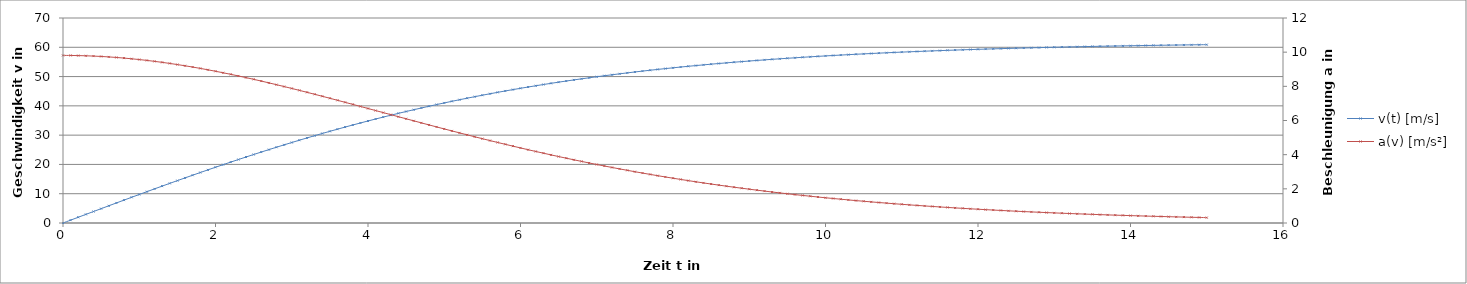
| Category | v(t) [m/s] |
|---|---|
| 0.0 | 0 |
| 0.1 | 0.981 |
| 0.2 | 1.962 |
| 0.30000000000000004 | 2.942 |
| 0.4 | 3.921 |
| 0.5 | 4.898 |
| 0.6 | 5.872 |
| 0.7 | 6.845 |
| 0.7999999999999999 | 7.814 |
| 0.8999999999999999 | 8.779 |
| 0.9999999999999999 | 9.74 |
| 1.0999999999999999 | 10.697 |
| 1.2 | 11.649 |
| 1.3 | 12.595 |
| 1.4000000000000001 | 13.535 |
| 1.5000000000000002 | 14.469 |
| 1.6000000000000003 | 15.397 |
| 1.7000000000000004 | 16.317 |
| 1.8000000000000005 | 17.23 |
| 1.9000000000000006 | 18.135 |
| 2.0000000000000004 | 19.032 |
| 2.1000000000000005 | 19.92 |
| 2.2000000000000006 | 20.8 |
| 2.3000000000000007 | 21.67 |
| 2.400000000000001 | 22.531 |
| 2.500000000000001 | 23.382 |
| 2.600000000000001 | 24.223 |
| 2.700000000000001 | 25.053 |
| 2.800000000000001 | 25.874 |
| 2.9000000000000012 | 26.683 |
| 3.0000000000000013 | 27.482 |
| 3.1000000000000014 | 28.27 |
| 3.2000000000000015 | 29.046 |
| 3.3000000000000016 | 29.811 |
| 3.4000000000000017 | 30.565 |
| 3.5000000000000018 | 31.307 |
| 3.600000000000002 | 32.037 |
| 3.700000000000002 | 32.755 |
| 3.800000000000002 | 33.461 |
| 3.900000000000002 | 34.156 |
| 4.000000000000002 | 34.838 |
| 4.100000000000001 | 35.508 |
| 4.200000000000001 | 36.166 |
| 4.300000000000001 | 36.813 |
| 4.4 | 37.447 |
| 4.5 | 38.069 |
| 4.6 | 38.679 |
| 4.699999999999999 | 39.277 |
| 4.799999999999999 | 39.863 |
| 4.899999999999999 | 40.437 |
| 4.999999999999998 | 40.999 |
| 5.099999999999998 | 41.55 |
| 5.1999999999999975 | 42.089 |
| 5.299999999999997 | 42.617 |
| 5.399999999999997 | 43.133 |
| 5.4999999999999964 | 43.637 |
| 5.599999999999996 | 44.131 |
| 5.699999999999996 | 44.613 |
| 5.799999999999995 | 45.085 |
| 5.899999999999995 | 45.545 |
| 5.999999999999995 | 45.995 |
| 6.099999999999994 | 46.435 |
| 6.199999999999994 | 46.864 |
| 6.299999999999994 | 47.283 |
| 6.399999999999993 | 47.691 |
| 6.499999999999993 | 48.09 |
| 6.5999999999999925 | 48.479 |
| 6.699999999999992 | 48.858 |
| 6.799999999999992 | 49.228 |
| 6.8999999999999915 | 49.589 |
| 6.999999999999991 | 49.94 |
| 7.099999999999991 | 50.283 |
| 7.19999999999999 | 50.617 |
| 7.29999999999999 | 50.942 |
| 7.39999999999999 | 51.258 |
| 7.499999999999989 | 51.567 |
| 7.599999999999989 | 51.867 |
| 7.699999999999989 | 52.159 |
| 7.799999999999988 | 52.444 |
| 7.899999999999988 | 52.721 |
| 7.999999999999988 | 52.99 |
| 8.099999999999987 | 53.252 |
| 8.199999999999987 | 53.507 |
| 8.299999999999986 | 53.755 |
| 8.399999999999986 | 53.997 |
| 8.499999999999986 | 54.231 |
| 8.599999999999985 | 54.459 |
| 8.699999999999985 | 54.681 |
| 8.799999999999985 | 54.897 |
| 8.899999999999984 | 55.106 |
| 8.999999999999984 | 55.31 |
| 9.099999999999984 | 55.508 |
| 9.199999999999983 | 55.7 |
| 9.299999999999983 | 55.887 |
| 9.399999999999983 | 56.068 |
| 9.499999999999982 | 56.244 |
| 9.599999999999982 | 56.415 |
| 9.699999999999982 | 56.582 |
| 9.799999999999981 | 56.743 |
| 9.89999999999998 | 56.9 |
| 9.99999999999998 | 57.052 |
| 10.09999999999998 | 57.2 |
| 10.19999999999998 | 57.343 |
| 10.29999999999998 | 57.482 |
| 10.399999999999979 | 57.618 |
| 10.499999999999979 | 57.749 |
| 10.599999999999978 | 57.876 |
| 10.699999999999978 | 57.999 |
| 10.799999999999978 | 58.119 |
| 10.899999999999977 | 58.236 |
| 10.999999999999977 | 58.348 |
| 11.099999999999977 | 58.458 |
| 11.199999999999976 | 58.564 |
| 11.299999999999976 | 58.667 |
| 11.399999999999975 | 58.767 |
| 11.499999999999975 | 58.864 |
| 11.599999999999975 | 58.958 |
| 11.699999999999974 | 59.049 |
| 11.799999999999974 | 59.137 |
| 11.899999999999974 | 59.223 |
| 11.999999999999973 | 59.306 |
| 12.099999999999973 | 59.387 |
| 12.199999999999973 | 59.465 |
| 12.299999999999972 | 59.541 |
| 12.399999999999972 | 59.614 |
| 12.499999999999972 | 59.685 |
| 12.599999999999971 | 59.754 |
| 12.69999999999997 | 59.821 |
| 12.79999999999997 | 59.886 |
| 12.89999999999997 | 59.949 |
| 12.99999999999997 | 60.01 |
| 13.09999999999997 | 60.069 |
| 13.199999999999969 | 60.126 |
| 13.299999999999969 | 60.182 |
| 13.399999999999968 | 60.236 |
| 13.499999999999968 | 60.288 |
| 13.599999999999968 | 60.338 |
| 13.699999999999967 | 60.387 |
| 13.799999999999967 | 60.435 |
| 13.899999999999967 | 60.481 |
| 13.999999999999966 | 60.525 |
| 14.099999999999966 | 60.569 |
| 14.199999999999966 | 60.61 |
| 14.299999999999965 | 60.651 |
| 14.399999999999965 | 60.69 |
| 14.499999999999964 | 60.728 |
| 14.599999999999964 | 60.765 |
| 14.699999999999964 | 60.801 |
| 14.799999999999963 | 60.836 |
| 14.899999999999963 | 60.869 |
| 14.999999999999963 | 60.902 |